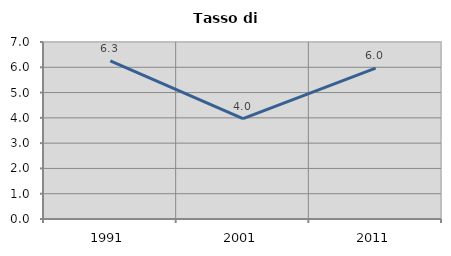
| Category | Tasso di disoccupazione   |
|---|---|
| 1991.0 | 6.253 |
| 2001.0 | 3.972 |
| 2011.0 | 5.969 |